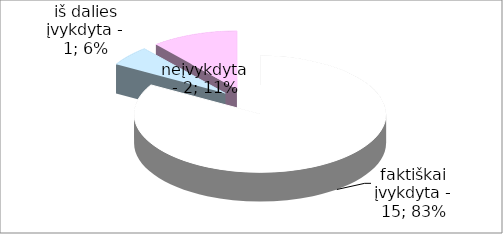
| Category | Series 0 |
|---|---|
| 0 | 15 |
| 1 | 1 |
| 2 | 2 |